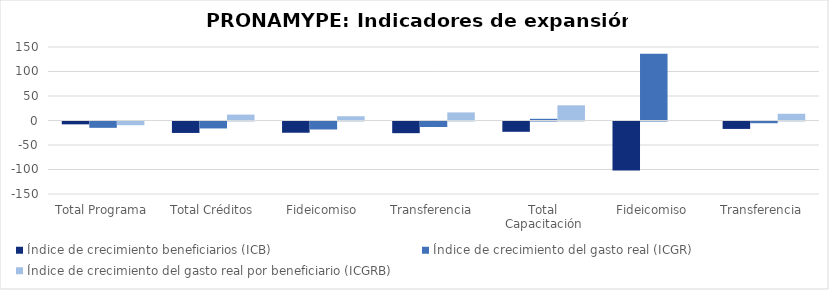
| Category | Índice de crecimiento beneficiarios (ICB)  | Índice de crecimiento del gasto real (ICGR)  | Índice de crecimiento del gasto real por beneficiario (ICGRB)  |
|---|---|---|---|
| Total Programa | -5.799 | -12.922 | -7.561 |
| Total Créditos | -23.366 | -14.148 | 12.029 |
| Fideicomiso | -22.963 | -16.281 | 8.674 |
| Transferencia | -23.83 | -11.266 | 16.495 |
| Total Capacitación | -21.017 | 3.438 | 30.963 |
| Fideicomiso | -100 | 136.026 | 0 |
| Transferencia | -15.155 | -3.491 | 13.747 |